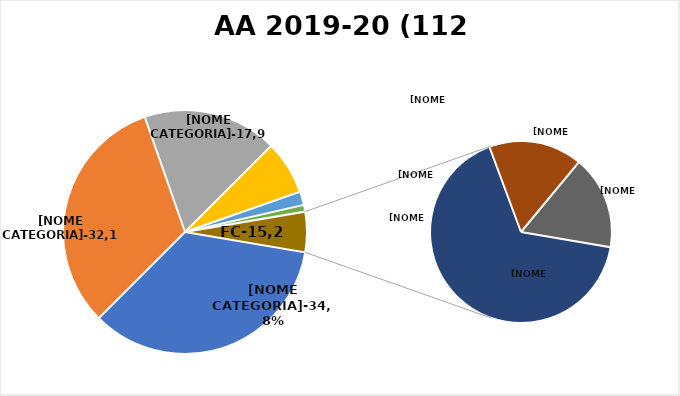
| Category | Series 0 |
|---|---|
| PRIMO ANNO | 39 |
| SECONDO ANNO | 36 |
| TERZO ANNO IC | 20 |
| FC 1 ANNO | 8 |
| FC 2 ANNI | 2 |
| FC 3 ANNI | 1 |
| FC 4 ANNI | 4 |
| FC 5 ANNI | 1 |
| FC 6 ANNI | 1 |